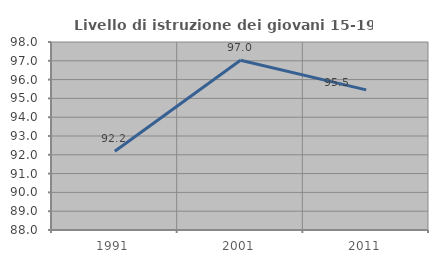
| Category | Livello di istruzione dei giovani 15-19 anni |
|---|---|
| 1991.0 | 92.188 |
| 2001.0 | 97.03 |
| 2011.0 | 95.455 |